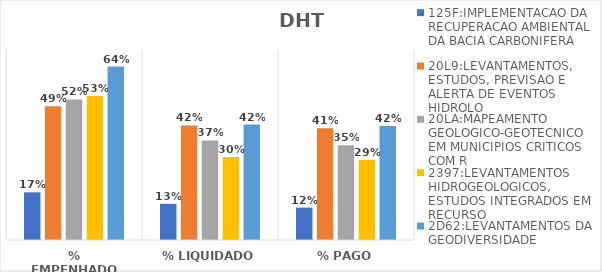
| Category | 125F:IMPLEMENTACAO DA RECUPERACAO AMBIENTAL DA BACIA CARBONIFERA | 20L9:LEVANTAMENTOS, ESTUDOS, PREVISAO E ALERTA DE EVENTOS HIDROLO | 20LA:MAPEAMENTO GEOLOGICO-GEOTECNICO EM MUNICIPIOS CRITICOS COM R | 2397:LEVANTAMENTOS HIDROGEOLOGICOS, ESTUDOS INTEGRADOS EM RECURSO | 2D62:LEVANTAMENTOS DA GEODIVERSIDADE |
|---|---|---|---|---|---|
| % EMPENHADO | 0.175 | 0.49 | 0.515 | 0.528 | 0.636 |
| % LIQUIDADO | 0.133 | 0.42 | 0.365 | 0.304 | 0.423 |
| % PAGO | 0.119 | 0.41 | 0.347 | 0.293 | 0.418 |